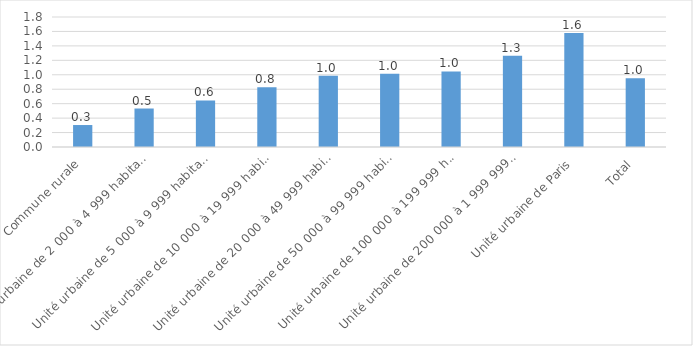
| Category | Series 0 |
|---|---|
| Commune rurale | 0.304 |
| Unité urbaine de 2 000 à 4 999 habitants | 0.533 |
| Unité urbaine de 5 000 à 9 999 habitants | 0.645 |
| Unité urbaine de 10 000 à 19 999 habitants | 0.828 |
| Unité urbaine de 20 000 à 49 999 habitants | 0.987 |
| Unité urbaine de 50 000 à 99 999 habitants | 1.013 |
| Unité urbaine de 100 000 à 199 999 habitants | 1.046 |
| Unité urbaine de 200 000 à 1 999 999 habitants | 1.264 |
| Unité urbaine de Paris | 1.578 |
| Total | 0.954 |